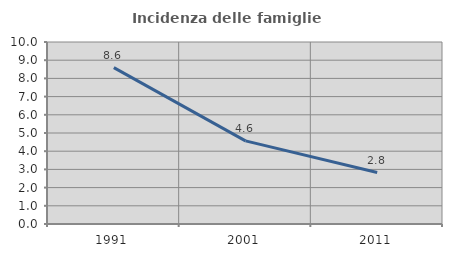
| Category | Incidenza delle famiglie numerose |
|---|---|
| 1991.0 | 8.589 |
| 2001.0 | 4.566 |
| 2011.0 | 2.826 |